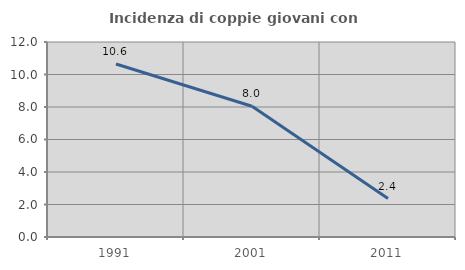
| Category | Incidenza di coppie giovani con figli |
|---|---|
| 1991.0 | 10.648 |
| 2001.0 | 8.046 |
| 2011.0 | 2.362 |